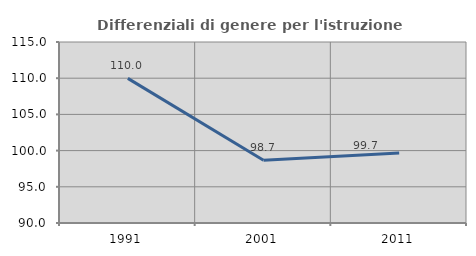
| Category | Differenziali di genere per l'istruzione superiore |
|---|---|
| 1991.0 | 109.977 |
| 2001.0 | 98.659 |
| 2011.0 | 99.677 |